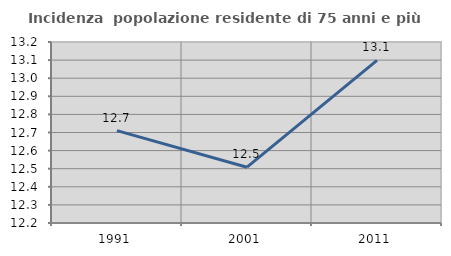
| Category | Incidenza  popolazione residente di 75 anni e più |
|---|---|
| 1991.0 | 12.71 |
| 2001.0 | 12.508 |
| 2011.0 | 13.098 |